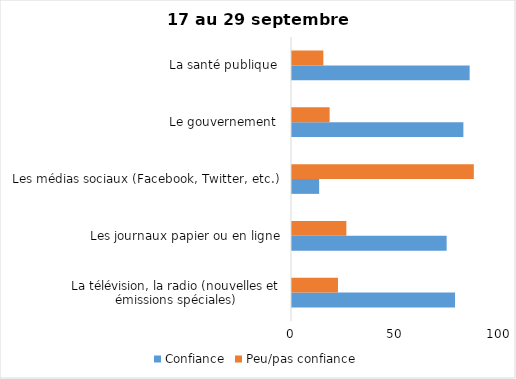
| Category | Confiance | Peu/pas confiance |
|---|---|---|
| La télévision, la radio (nouvelles et émissions spéciales) | 78 | 22 |
| Les journaux papier ou en ligne | 74 | 26 |
| Les médias sociaux (Facebook, Twitter, etc.) | 13 | 87 |
| Le gouvernement  | 82 | 18 |
| La santé publique  | 85 | 15 |